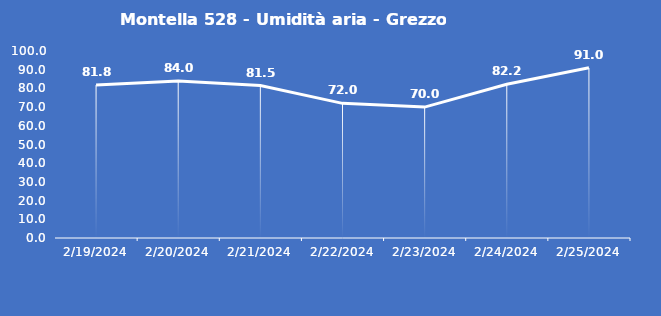
| Category | Montella 528 - Umidità aria - Grezzo (%) |
|---|---|
| 2/19/24 | 81.8 |
| 2/20/24 | 84 |
| 2/21/24 | 81.5 |
| 2/22/24 | 72 |
| 2/23/24 | 70 |
| 2/24/24 | 82.2 |
| 2/25/24 | 91 |